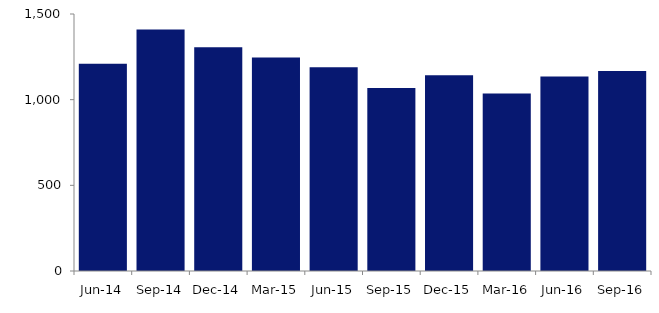
| Category | Series 0 |
|---|---|
| Jun-14 | 1210 |
| Sep-14 | 1410 |
| Dec-14 | 1306 |
| Mar-15 | 1246 |
| Jun-15 | 1189 |
| Sep-15 | 1068 |
| Dec-15 | 1143 |
| Mar-16 | 1036 |
| Jun-16 | 1135 |
| Sep-16 | 1168 |